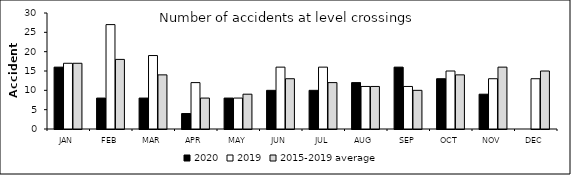
| Category | 2020 | 2019 | 2015-2019 average |
|---|---|---|---|
| JAN | 16 | 17 | 17 |
| FEB | 8 | 27 | 18 |
| MAR | 8 | 19 | 14 |
| APR | 4 | 12 | 8 |
| MAY | 8 | 8 | 9 |
| JUN | 10 | 16 | 13 |
| JUL | 10 | 16 | 12 |
| AUG | 12 | 11 | 11 |
| SEP | 16 | 11 | 10 |
| OCT | 13 | 15 | 14 |
| NOV | 9 | 13 | 16 |
| DEC | 0 | 13 | 15 |